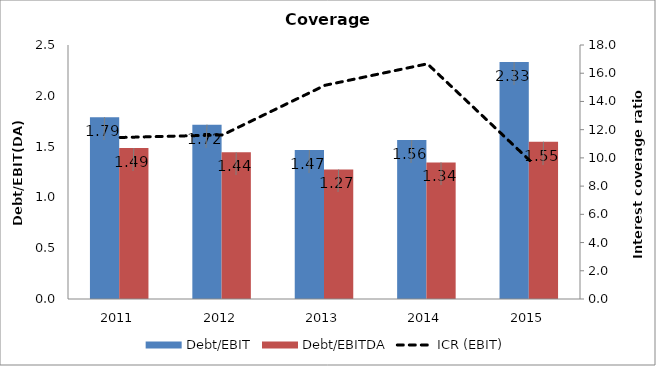
| Category | Debt/EBIT | Debt/EBITDA |
|---|---|---|
| 2011.0 | 1.79 | 1.486 |
| 2012.0 | 1.716 | 1.443 |
| 2013.0 | 1.466 | 1.275 |
| 2014.0 | 1.564 | 1.345 |
| 2015.0 | 2.332 | 1.548 |